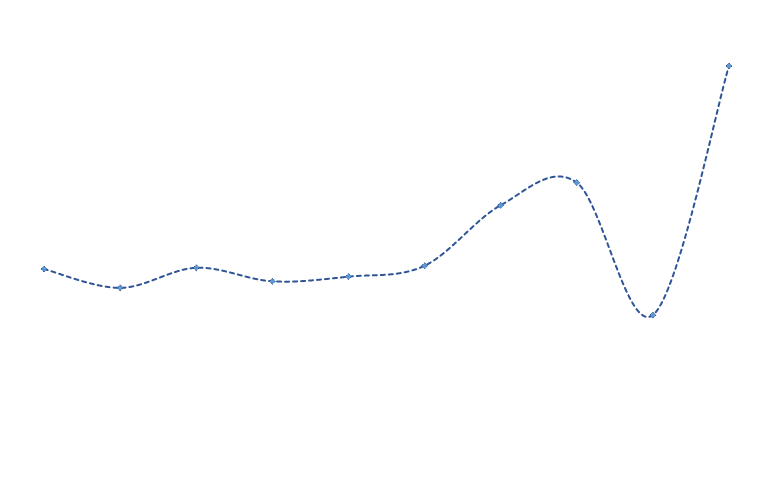
| Category | Series 0 |
|---|---|
| 0 | 24846.492 |
| 1 | 24584.971 |
| 2 | 24864.227 |
| 3 | 24676.222 |
| 4 | 24740.806 |
| 5 | 24892.099 |
| 6 | 25732.182 |
| 7 | 26047.475 |
| 8 | 24206.68 |
| 9 | 27666.598 |